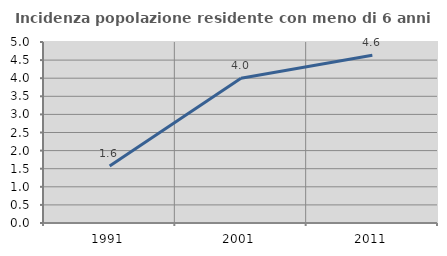
| Category | Incidenza popolazione residente con meno di 6 anni |
|---|---|
| 1991.0 | 1.578 |
| 2001.0 | 4 |
| 2011.0 | 4.636 |